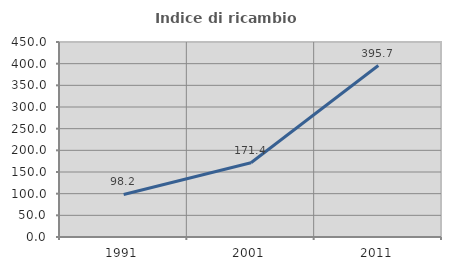
| Category | Indice di ricambio occupazionale  |
|---|---|
| 1991.0 | 98.246 |
| 2001.0 | 171.429 |
| 2011.0 | 395.652 |